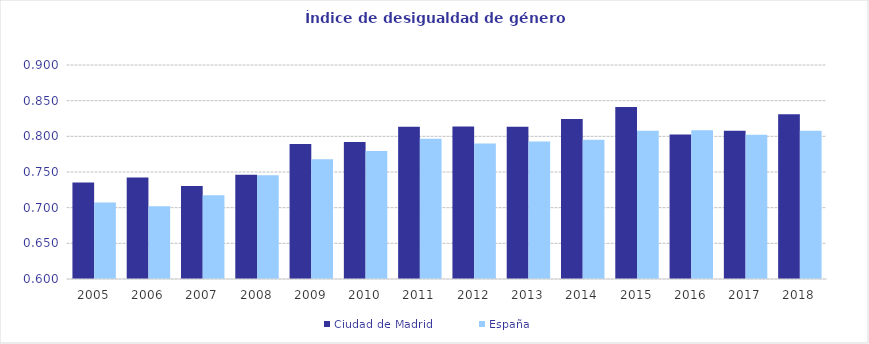
| Category | Ciudad de Madrid | España |
|---|---|---|
| 2005.0 | 0.735 | 0.707 |
| 2006.0 | 0.742 | 0.702 |
| 2007.0 | 0.73 | 0.717 |
| 2008.0 | 0.746 | 0.745 |
| 2009.0 | 0.789 | 0.768 |
| 2010.0 | 0.792 | 0.779 |
| 2011.0 | 0.813 | 0.797 |
| 2012.0 | 0.814 | 0.79 |
| 2013.0 | 0.813 | 0.793 |
| 2014.0 | 0.824 | 0.795 |
| 2015.0 | 0.841 | 0.808 |
| 2016.0 | 0.803 | 0.809 |
| 2017.0 | 0.808 | 0.802 |
| 2018.0 | 0.831 | 0.808 |